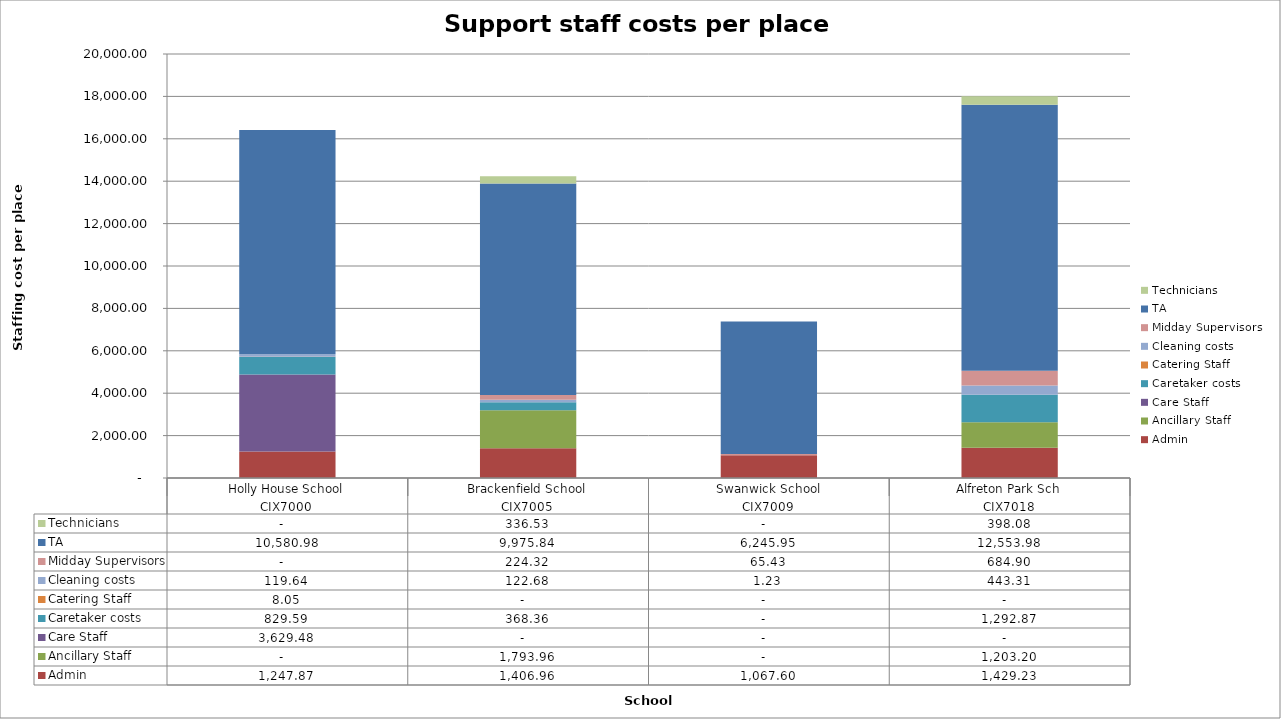
| Category | Admin | Ancillary Staff | Care Staff | Caretaker costs | Catering Staff  | Cleaning costs | Midday Supervisors | TA | Technicians |
|---|---|---|---|---|---|---|---|---|---|
| 0 | 1247.873 | 0 | 3629.476 | 829.595 | 8.054 | 119.639 | 0 | 10580.978 | 0 |
| 1 | 1406.96 | 1793.963 | 0 | 368.363 | 0 | 122.676 | 224.322 | 9975.839 | 336.527 |
| 2 | 1067.596 | 0 | 0 | 0 | 0 | 1.23 | 65.43 | 6245.948 | 0 |
| 3 | 1429.231 | 1203.196 | 0 | 1292.869 | 0 | 443.312 | 684.9 | 12553.985 | 398.083 |